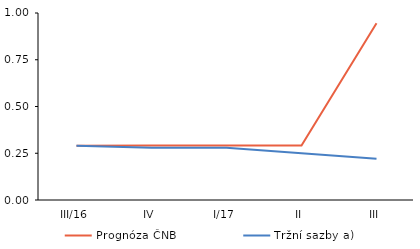
| Category | Prognóza ČNB | Tržní sazby a) |
|---|---|---|
| III/16 | 0.29 | 0.29 |
| IV | 0.291 | 0.28 |
| I/17 | 0.291 | 0.28 |
| II | 0.291 | 0.25 |
| III | 0.945 | 0.22 |